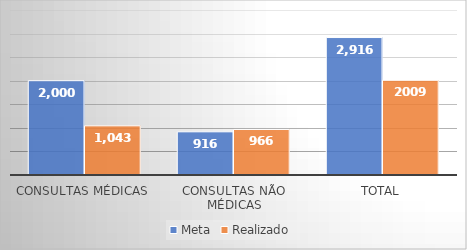
| Category | Meta | Realizado |
|---|---|---|
| Consultas Médicas | 2000 | 1043 |
| Consultas não médicas | 916 | 966 |
| Total | 2916 | 2009 |